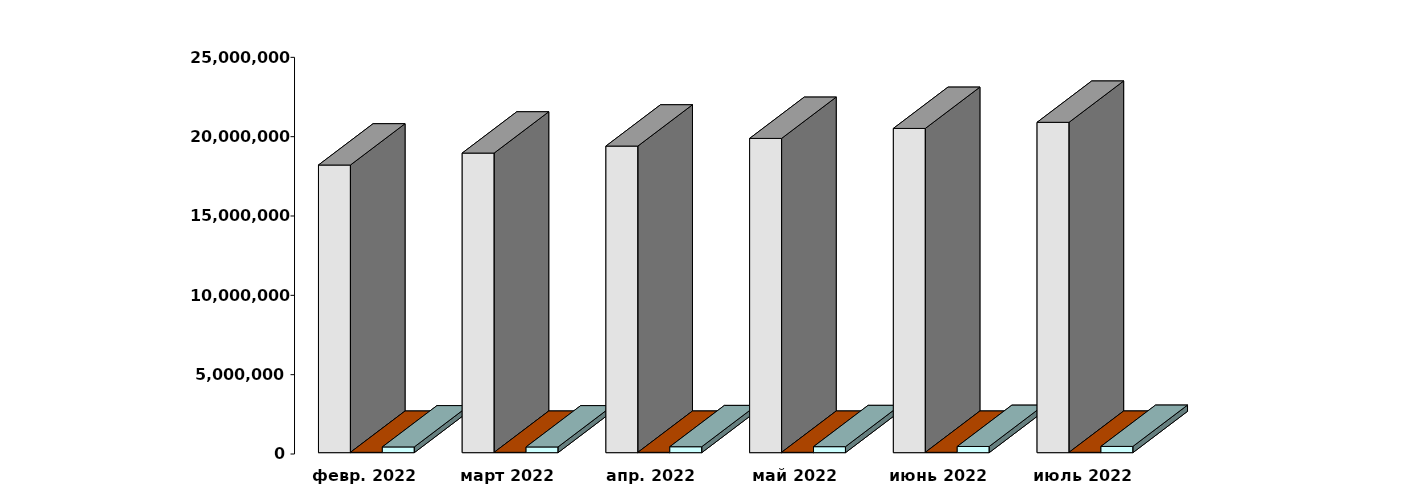
| Category | Физические лица | Юридические лица | Клиенты, передавшие свои средства в ДУ |
|---|---|---|---|
| 2022-02-28 | 18128529 | 20698 | 361205 |
| 2022-03-30 | 18881687 | 21131 | 360205 |
| 2022-04-30 | 19323213 | 21524 | 374023 |
| 2022-05-30 | 19805248 | 21686 | 377979 |
| 2022-06-30 | 20434402 | 21881 | 390501 |
| 2022-07-30 | 20820354 | 22103 | 394494 |